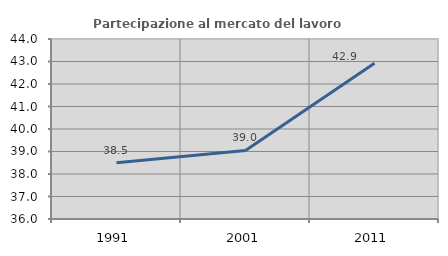
| Category | Partecipazione al mercato del lavoro  femminile |
|---|---|
| 1991.0 | 38.499 |
| 2001.0 | 39.049 |
| 2011.0 | 42.92 |